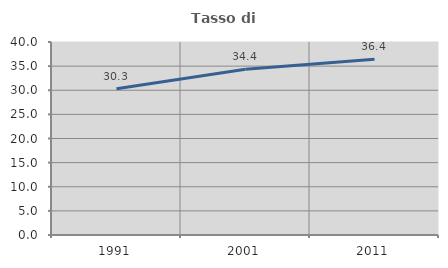
| Category | Tasso di occupazione   |
|---|---|
| 1991.0 | 30.305 |
| 2001.0 | 34.351 |
| 2011.0 | 36.445 |